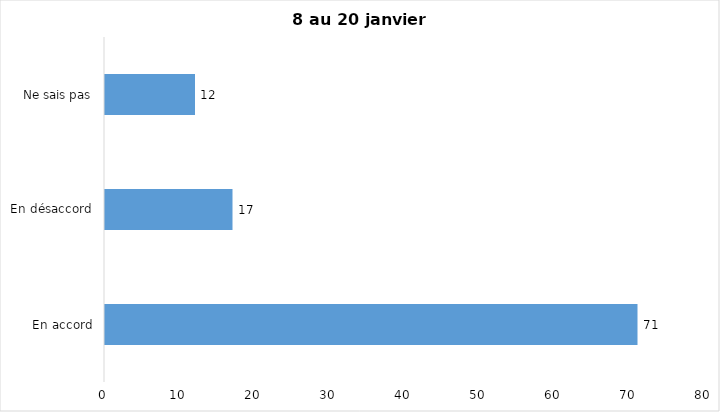
| Category | J’ai l’intention de recevoir le vaccin contre la COVID-19 lorsqu’il
sera disponible |
|---|---|
| En accord | 71 |
| En désaccord | 17 |
| Ne sais pas | 12 |